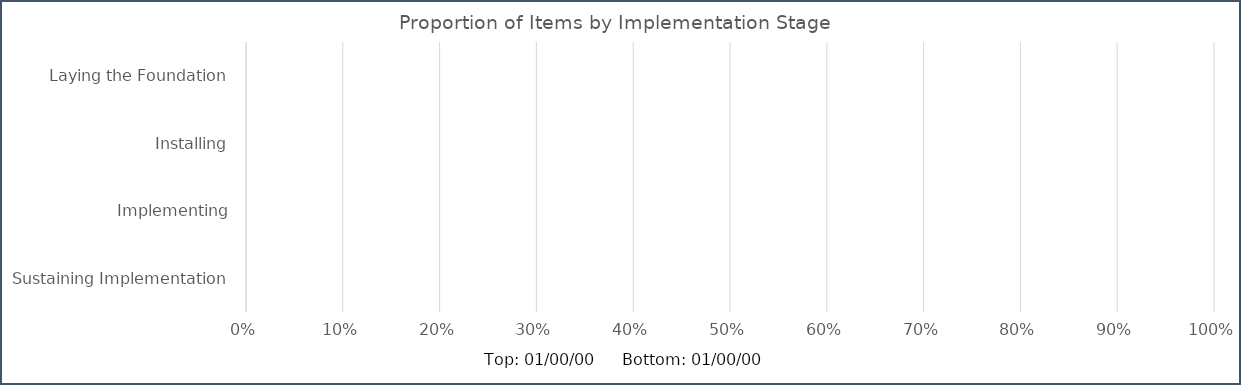
| Category | Top: 01/00/00 | Bottom: 01/00/00 |
|---|---|---|
| Laying the Foundation | 0 | 0 |
| Installing | 0 | 0 |
| Implementing | 0 | 0 |
| Sustaining Implementation | 0 | 0 |